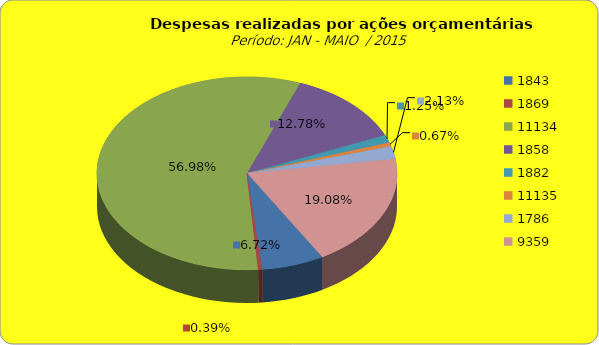
| Category | Series 1 |
|---|---|
| 1843.0 | 6442871.19 |
| 1869.0 | 377483.66 |
| 11134.0 | 54607393.08 |
| 1858.0 | 12249992.74 |
| 1882.0 | 1202637.12 |
| 11135.0 | 637537.54 |
| 1786.0 | 2039473.41 |
| 9359.0 | 18284622.73 |